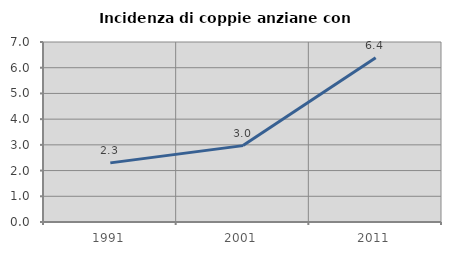
| Category | Incidenza di coppie anziane con figli |
|---|---|
| 1991.0 | 2.299 |
| 2001.0 | 2.97 |
| 2011.0 | 6.383 |